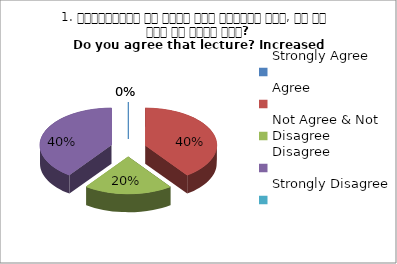
| Category | 1. व्याख्यान से रूचि में वृद्धि हुई, आप इस बात से सहमत हैं?
Do you agree that lecture? Increased interest?
 |
|---|---|
| Strongly Agree | 0 |
| Agree | 2 |
| Not Agree & Not Disagree | 1 |
| Disagree | 2 |
| Strongly Disagree | 0 |